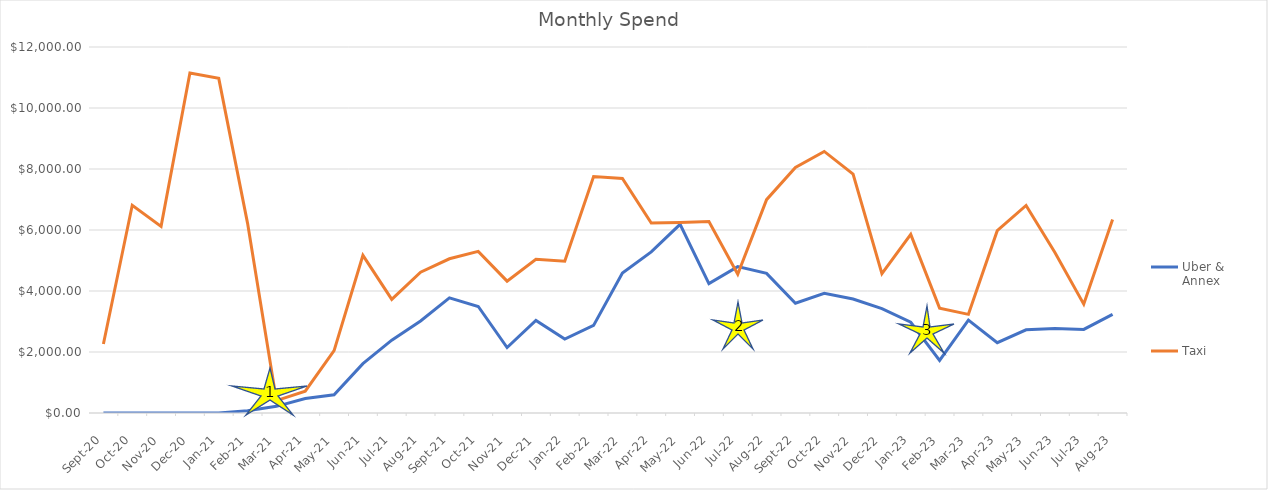
| Category | Uber & Annex | Taxi |
|---|---|---|
| 2020-09-01 | 0 | 2261.5 |
| 2020-10-01 | 0 | 6810.3 |
| 2020-11-01 | 0 | 6119.6 |
| 2020-12-01 | 0 | 11144.6 |
| 2021-01-01 | 0 | 10971.5 |
| 2021-02-01 | 73.1 | 6218 |
| 2021-03-01 | 218.64 | 406.5 |
| 2021-04-01 | 476.11 | 714 |
| 2021-05-01 | 598.13 | 2043 |
| 2021-06-01 | 1618.72 | 5170.3 |
| 2021-07-01 | 2388.37 | 3724.5 |
| 2021-08-01 | 3017.75 | 4617.5 |
| 2021-09-01 | 3774.34 | 5056.5 |
| 2021-10-01 | 3492.27 | 5300.3 |
| 2021-11-01 | 2147.85 | 4323.3 |
| 2021-12-01 | 3032.66 | 5040 |
| 2022-01-01 | 2426.53 | 4973.9 |
| 2022-02-01 | 2872.53 | 7755.5 |
| 2022-03-01 | 4590.11 | 7691.3 |
| 2022-04-01 | 5282.77 | 6230.5 |
| 2022-05-01 | 6185.38 | 6246.1 |
| 2022-06-01 | 4243.07 | 6277 |
| 2022-07-01 | 4798.18 | 4549.4 |
| 2022-08-01 | 4578.69 | 6995.95 |
| 2022-09-01 | 3598.24 | 8047.45 |
| 2022-10-01 | 3921.32 | 8576 |
| 2022-11-01 | 3738.53 | 7833.65 |
| 2022-12-01 | 3419.72 | 4565.3 |
| 2023-01-01 | 2975.65 | 5856.35 |
| 2023-02-01 | 1724.79 | 3438 |
| 2023-03-01 | 3045.43 | 3234.3 |
| 2023-04-01 | 2303.51 | 5977.1 |
| 2023-05-01 | 2726.23 | 6804.05 |
| 2023-06-01 | 2766.79 | 5261.9 |
| 2023-07-01 | 2741.18 | 3569.1 |
| 2023-08-01 | 3235.79 | 6346.55 |